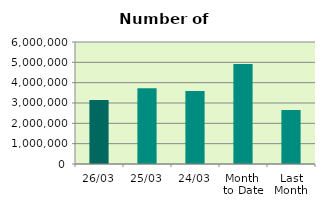
| Category | Series 0 |
|---|---|
| 26/03 | 3150024 |
| 25/03 | 3730296 |
| 24/03 | 3590194 |
| Month 
to Date | 4916560.316 |
| Last
Month | 2656039 |